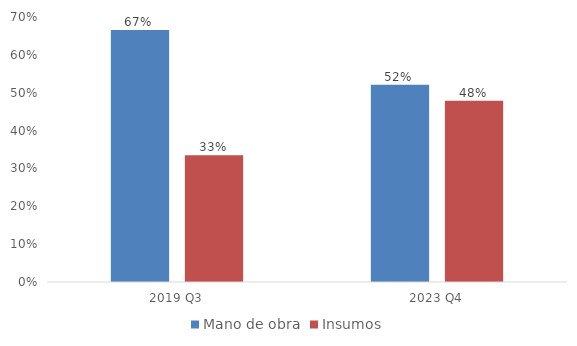
| Category | Mano de obra | Insumos |
|---|---|---|
| 2019 Q3 | 0.665 | 0.335 |
| 2023 Q4 | 0.521 | 0.479 |